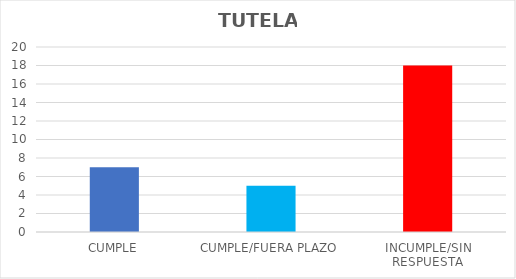
| Category | TOTAL |
|---|---|
| CUMPLE | 7 |
| CUMPLE/FUERA PLAZO | 5 |
| INCUMPLE/SIN RESPUESTA | 18 |